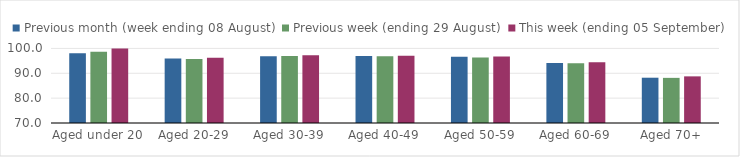
| Category | Previous month (week ending 08 August) | Previous week (ending 29 August) | This week (ending 05 September) |
|---|---|---|---|
| Aged under 20 | 98.09 | 98.67 | 100.02 |
| Aged 20-29 | 95.92 | 95.74 | 96.24 |
| Aged 30-39 | 96.88 | 96.95 | 97.21 |
| Aged 40-49 | 96.99 | 96.85 | 97.02 |
| Aged 50-59 | 96.61 | 96.32 | 96.75 |
| Aged 60-69 | 94.09 | 94.05 | 94.45 |
| Aged 70+ | 88.22 | 88.16 | 88.76 |